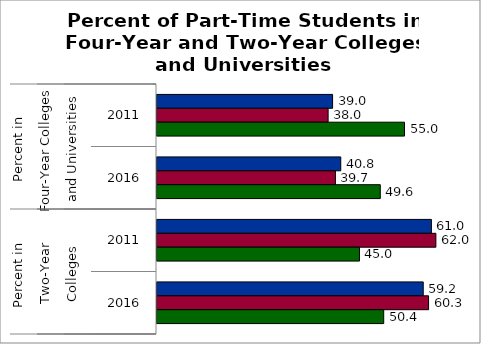
| Category | 50 states and D.C. | SREB states | State |
|---|---|---|---|
| 0 | 39.02 | 38.025 | 55.002 |
| 1 | 40.837 | 39.651 | 49.621 |
| 2 | 60.98 | 61.975 | 44.998 |
| 3 | 59.163 | 60.349 | 50.379 |